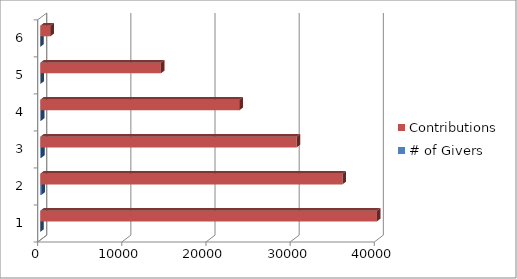
| Category | # of Givers | Contributions |
|---|---|---|
| 0 | 0 | 40000 |
| 1 | 133 | 35912 |
| 2 | 101 | 30478 |
| 3 | 75 | 23663 |
| 4 | 36 | 14332 |
| 5 | 3 | 1206 |